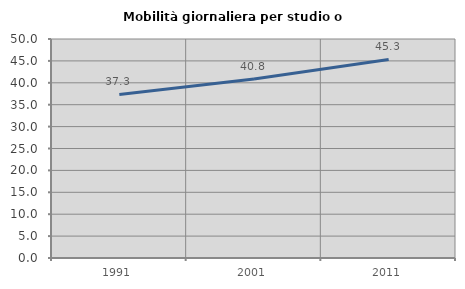
| Category | Mobilità giornaliera per studio o lavoro |
|---|---|
| 1991.0 | 37.333 |
| 2001.0 | 40.845 |
| 2011.0 | 45.333 |